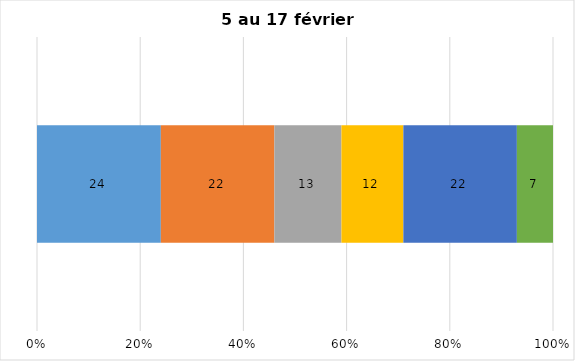
| Category | Plusieurs fois par jour | Une fois par jour | Quelques fois par semaine   | Une fois par semaine ou moins   |  Jamais   |  Je n’utilise pas les médias sociaux |
|---|---|---|---|---|---|---|
| 0 | 24 | 22 | 13 | 12 | 22 | 7 |